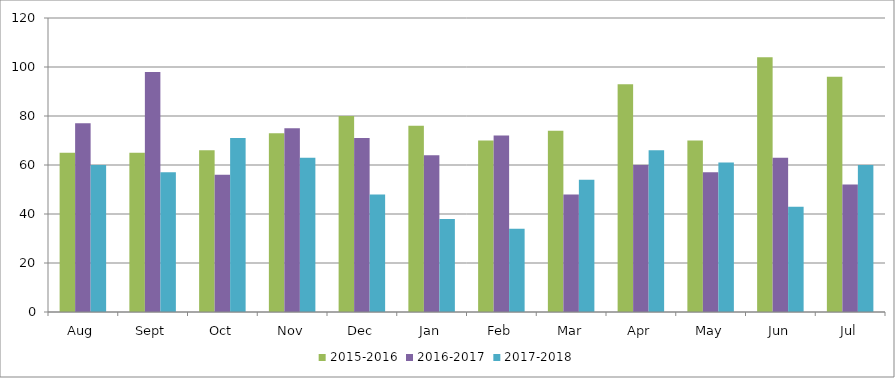
| Category | 2015-2016 | 2016-2017 | 2017-2018 |
|---|---|---|---|
| Aug | 65 | 77 | 60 |
| Sept | 65 | 98 | 57 |
| Oct | 66 | 56 | 71 |
| Nov | 73 | 75 | 63 |
| Dec | 80 | 71 | 48 |
| Jan | 76 | 64 | 38 |
| Feb | 70 | 72 | 34 |
| Mar | 74 | 48 | 54 |
| Apr | 93 | 60 | 66 |
| May | 70 | 57 | 61 |
| Jun | 104 | 63 | 43 |
| Jul | 96 | 52 | 60 |